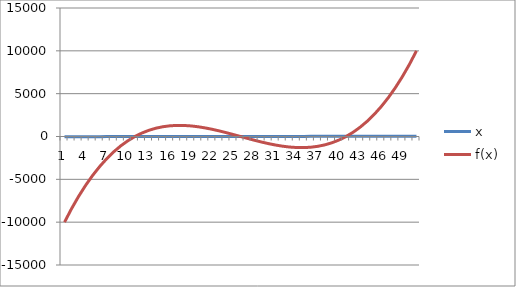
| Category | x | f(x) |
|---|---|---|
| 0 | -20 | -10000 |
| 1 | -19 | -8424 |
| 2 | -18 | -6992 |
| 3 | -17 | -5698 |
| 4 | -16 | -4536 |
| 5 | -15 | -3500 |
| 6 | -14 | -2584 |
| 7 | -13 | -1782 |
| 8 | -12 | -1088 |
| 9 | -11 | -496 |
| 10 | -10 | 0 |
| 11 | -9 | 406 |
| 12 | -8 | 728 |
| 13 | -7 | 972 |
| 14 | -6 | 1144 |
| 15 | -5 | 1250 |
| 16 | -4 | 1296 |
| 17 | -3 | 1288 |
| 18 | -2 | 1232 |
| 19 | -1 | 1134 |
| 20 | 0 | 1000 |
| 21 | 1 | 836 |
| 22 | 2 | 648 |
| 23 | 3 | 442 |
| 24 | 4 | 224 |
| 25 | 5 | 0 |
| 26 | 6 | -224 |
| 27 | 7 | -442 |
| 28 | 8 | -648 |
| 29 | 9 | -836 |
| 30 | 10 | -1000 |
| 31 | 11 | -1134 |
| 32 | 12 | -1232 |
| 33 | 13 | -1288 |
| 34 | 14 | -1296 |
| 35 | 15 | -1250 |
| 36 | 16 | -1144 |
| 37 | 17 | -972 |
| 38 | 18 | -728 |
| 39 | 19 | -406 |
| 40 | 20 | 0 |
| 41 | 21 | 496 |
| 42 | 22 | 1088 |
| 43 | 23 | 1782 |
| 44 | 24 | 2584 |
| 45 | 25 | 3500 |
| 46 | 26 | 4536 |
| 47 | 27 | 5698 |
| 48 | 28 | 6992 |
| 49 | 29 | 8424 |
| 50 | 30 | 10000 |